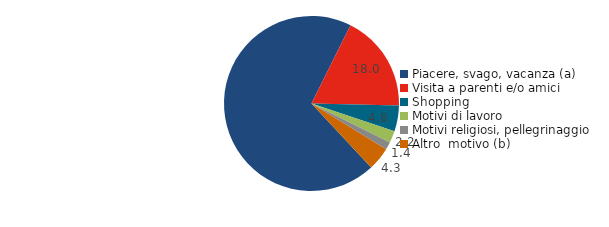
| Category | Series 0 |
|---|---|
| Piacere, svago, vacanza (a) | 69.3 |
| Visita a parenti e/o amici | 18 |
| Shopping | 4.8 |
| Motivi di lavoro  | 2.2 |
| Motivi religiosi, pellegrinaggio  | 1.4 |
| Altro  motivo (b)                              | 4.3 |